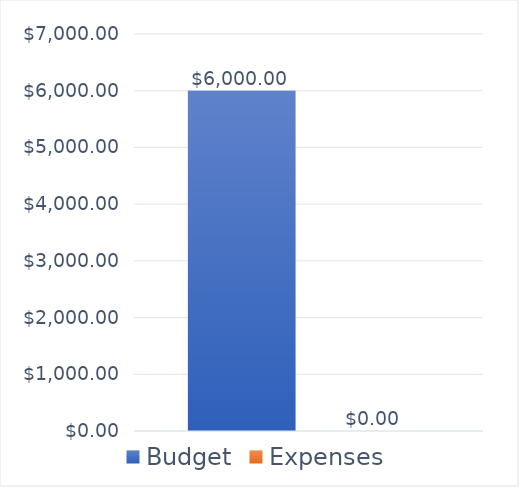
| Category | Budget | Expenses |
|---|---|---|
| 0 | 6000 | 0 |